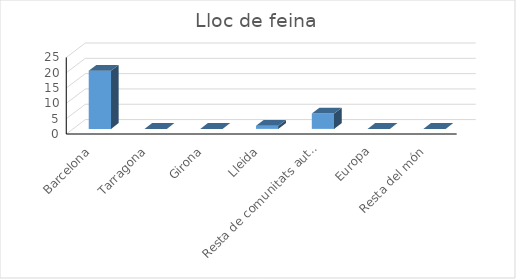
| Category | Series 0 |
|---|---|
| Barcelona | 19 |
| Tarragona | 0 |
| Girona | 0 |
| Lleida | 1 |
| Resta de comunitats autònomes | 5 |
| Europa | 0 |
| Resta del món | 0 |